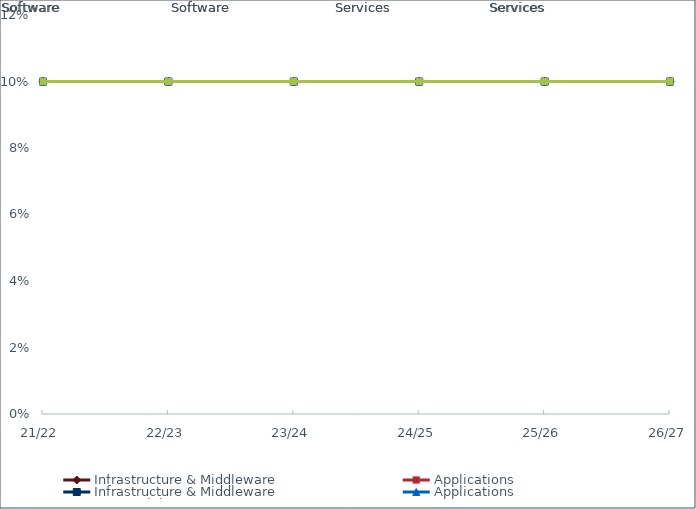
| Category | Infrastructure & Middleware | Applications | Connectivity |
|---|---|---|---|
| 21/22 | 0.1 | 0.1 | 0.1 |
| 22/23 | 0.1 | 0.1 | 0.1 |
| 23/24 | 0.1 | 0.1 | 0.1 |
| 24/25 | 0.1 | 0.1 | 0.1 |
| 25/26 | 0.1 | 0.1 | 0.1 |
| 26/27 | 0.1 | 0.1 | 0.1 |